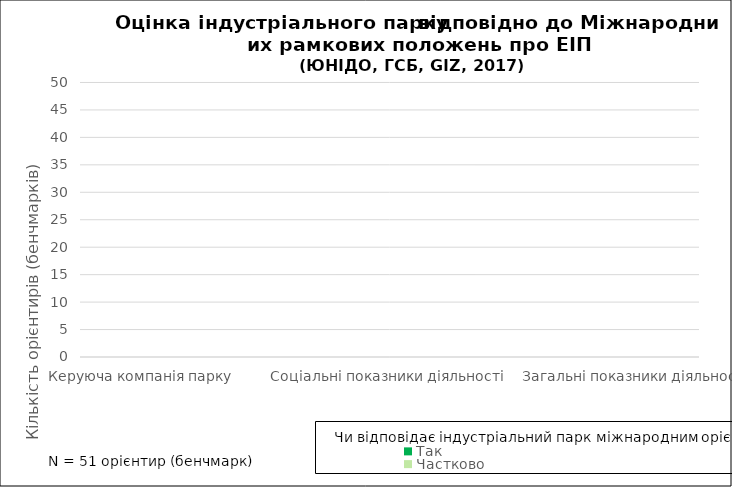
| Category | Так | Частково | Ні | Необхідне підтвердження | Не застосовно |
|---|---|---|---|---|---|
| Керуюча компанія парку | 0 | 0 | 0 | 0 | 0 |
| Екологічні показники діяльності | 0 | 0 | 0 | 0 | 0 |
| Соціальні показники діяльності | 0 | 0 | 0 | 0 | 0 |
| Економічні показники діяльності | 0 | 0 | 0 | 0 | 0 |
| Загальні показники діяльності | 0 | 0 | 0 | 0 | 0 |